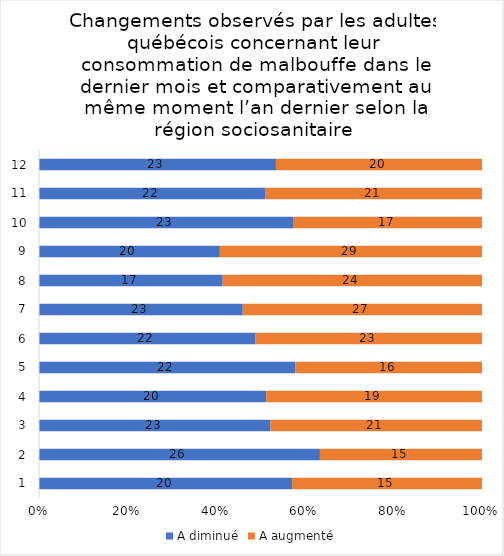
| Category | A diminué | A augmenté |
|---|---|---|
| 0 | 20 | 15 |
| 1 | 26 | 15 |
| 2 | 23 | 21 |
| 3 | 20 | 19 |
| 4 | 22 | 16 |
| 5 | 22 | 23 |
| 6 | 23 | 27 |
| 7 | 17 | 24 |
| 8 | 20 | 29 |
| 9 | 23 | 17 |
| 10 | 22 | 21 |
| 11 | 23 | 20 |